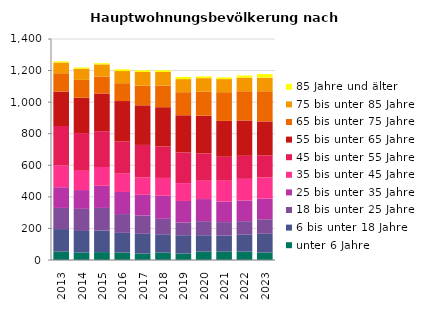
| Category | unter 6 Jahre | 6 bis unter 18 Jahre | 18 bis unter 25 Jahre | 25 bis unter 35 Jahre | 35 bis unter 45 Jahre | 45 bis unter 55 Jahre | 55 bis unter 65 Jahre | 65 bis unter 75 Jahre | 75 bis unter 85 Jahre | 85 Jahre und älter |
|---|---|---|---|---|---|---|---|---|---|---|
| 2013.0 | 53 | 143 | 134 | 131 | 137 | 251 | 218 | 116 | 68 | 8 |
| 2014.0 | 47 | 137 | 140 | 119 | 122 | 239 | 224 | 113 | 71 | 8 |
| 2015.0 | 50 | 137 | 143 | 140 | 119 | 227 | 239 | 107 | 77 | 8 |
| 2016.0 | 47 | 125 | 119 | 140 | 116 | 203 | 257 | 113 | 77 | 11 |
| 2017.0 | 41 | 125 | 116 | 131 | 110 | 206 | 251 | 125 | 86 | 11 |
| 2018.0 | 47 | 116 | 98 | 146 | 113 | 200 | 248 | 137 | 86 | 11 |
| 2019.0 | 41 | 116 | 80 | 137 | 113 | 194 | 236 | 146 | 83 | 14 |
| 2020.0 | 53 | 104 | 89 | 140 | 116 | 173 | 239 | 152 | 86 | 11 |
| 2021.0 | 53 | 101 | 86 | 131 | 131 | 152 | 227 | 182 | 83 | 11 |
| 2022.0 | 53 | 107 | 86 | 131 | 137 | 146 | 224 | 185 | 86 | 14 |
| 2023.0 | 47 | 119 | 92 | 131 | 134 | 140 | 215 | 191 | 86 | 23 |